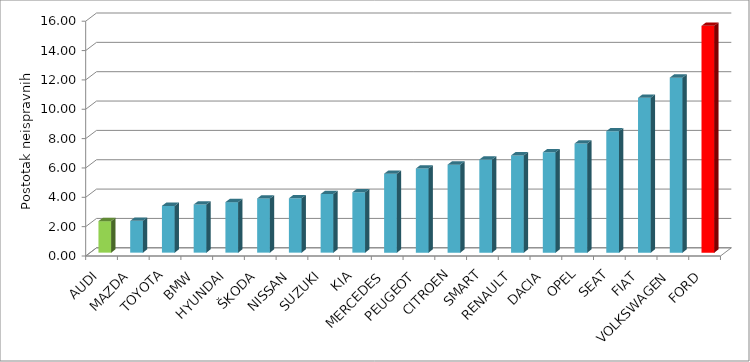
| Category | Series 4 |
|---|---|
| AUDI | 2.147 |
| MAZDA | 2.168 |
| TOYOTA | 3.186 |
| BMW | 3.28 |
| HYUNDAI | 3.441 |
| ŠKODA | 3.694 |
| NISSAN | 3.705 |
| SUZUKI | 3.995 |
| KIA | 4.114 |
| MERCEDES | 5.381 |
| PEUGEOT | 5.736 |
| CITROEN | 5.998 |
| SMART | 6.347 |
| RENAULT | 6.628 |
| DACIA | 6.84 |
| OPEL | 7.44 |
| SEAT | 8.278 |
| FIAT | 10.554 |
| VOLKSWAGEN | 11.926 |
| FORD | 15.456 |